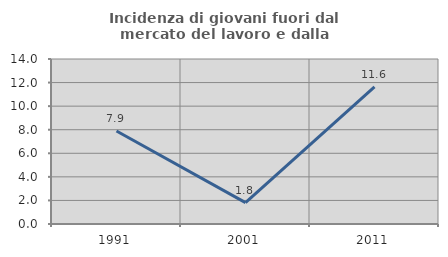
| Category | Incidenza di giovani fuori dal mercato del lavoro e dalla formazione  |
|---|---|
| 1991.0 | 7.895 |
| 2001.0 | 1.818 |
| 2011.0 | 11.628 |